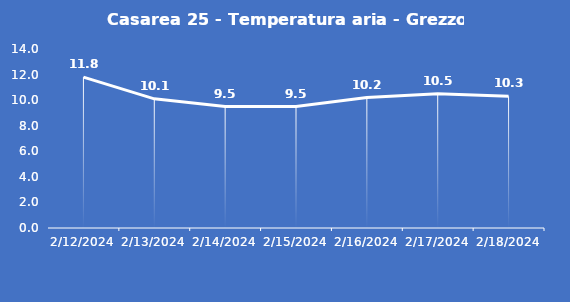
| Category | Casarea 25 - Temperatura aria - Grezzo (°C) |
|---|---|
| 2/12/24 | 11.8 |
| 2/13/24 | 10.1 |
| 2/14/24 | 9.5 |
| 2/15/24 | 9.5 |
| 2/16/24 | 10.2 |
| 2/17/24 | 10.5 |
| 2/18/24 | 10.3 |